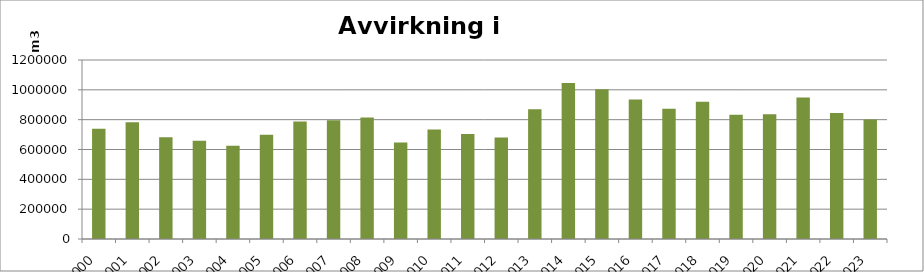
| Category | Totalt |
|---|---|
| 2000 | 739147 |
| 2001 | 782342 |
| 2002 | 682469 |
| 2003 | 659451 |
| 2004 | 625293 |
| 2005 | 698431 |
| 2006 | 787030 |
| 2007 | 795331 |
| 2008 | 813775 |
| 2009 | 646315 |
| 2010 | 733304 |
| 2011 | 704386 |
| 2012 | 680065 |
| 2013 | 870516 |
| 2014 | 1046122 |
| 2015 | 1003383 |
| 2016 | 934795 |
| 2017 | 873623 |
| 2018 | 920743 |
| 2019 | 832367 |
| 2020 | 836616 |
| 2021 | 948718 |
| 2022 | 845313 |
| 2023 | 800457 |